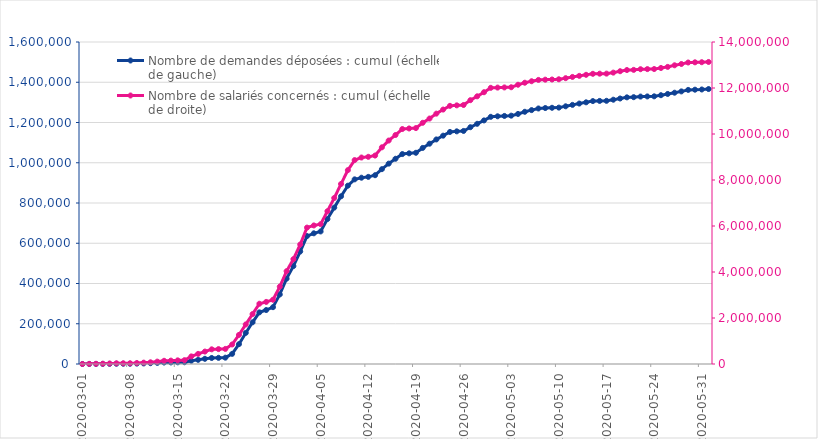
| Category | Nombre de demandes déposées : cumul (échelle de gauche) |
|---|---|
| 2020-03-01 | 1 |
| 2020-03-02 | 126 |
| 2020-03-03 | 291 |
| 2020-03-04 | 493 |
| 2020-03-05 | 799 |
| 2020-03-06 | 1277 |
| 2020-03-07 | 1302 |
| 2020-03-08 | 1319 |
| 2020-03-09 | 1952 |
| 2020-03-10 | 2803 |
| 2020-03-11 | 3916 |
| 2020-03-12 | 5468 |
| 2020-03-13 | 7249 |
| 2020-03-14 | 7716 |
| 2020-03-15 | 8366 |
| 2020-03-16 | 8691 |
| 2020-03-17 | 16174 |
| 2020-03-18 | 20724 |
| 2020-03-19 | 25761 |
| 2020-03-20 | 30001 |
| 2020-03-21 | 30650 |
| 2020-03-22 | 31464 |
| 2020-03-23 | 50451 |
| 2020-03-24 | 98610 |
| 2020-03-25 | 154441 |
| 2020-03-26 | 207199 |
| 2020-03-27 | 256567 |
| 2020-03-28 | 268181 |
| 2020-03-29 | 282345 |
| 2020-03-30 | 345522 |
| 2020-03-31 | 424077 |
| 2020-04-01 | 486489 |
| 2020-04-02 | 558931 |
| 2020-04-03 | 635746 |
| 2020-04-04 | 649426 |
| 2020-04-05 | 658619 |
| 2020-04-06 | 720233 |
| 2020-04-07 | 777060 |
| 2020-04-08 | 833313 |
| 2020-04-09 | 886014 |
| 2020-04-10 | 917469 |
| 2020-04-11 | 925667 |
| 2020-04-12 | 929850 |
| 2020-04-13 | 938056 |
| 2020-04-14 | 968133 |
| 2020-04-15 | 995592 |
| 2020-04-16 | 1019842 |
| 2020-04-17 | 1043154 |
| 2020-04-18 | 1046810 |
| 2020-04-19 | 1049537 |
| 2020-04-20 | 1073713 |
| 2020-04-21 | 1094748 |
| 2020-04-22 | 1115829 |
| 2020-04-23 | 1134569 |
| 2020-04-24 | 1153040 |
| 2020-04-25 | 1156019 |
| 2020-04-26 | 1158008 |
| 2020-04-27 | 1176607 |
| 2020-04-28 | 1193548 |
| 2020-04-29 | 1210335 |
| 2020-04-30 | 1228238 |
| 2020-05-01 | 1230851 |
| 2020-05-02 | 1232604 |
| 2020-05-03 | 1234010 |
| 2020-05-04 | 1242497 |
| 2020-05-05 | 1253205 |
| 2020-05-06 | 1261642 |
| 2020-05-07 | 1269642 |
| 2020-05-08 | 1271844 |
| 2020-05-09 | 1273149 |
| 2020-05-10 | 1274017 |
| 2020-05-11 | 1280465 |
| 2020-05-12 | 1287513 |
| 2020-05-13 | 1294171 |
| 2020-05-14 | 1300274 |
| 2020-05-15 | 1306412 |
| 2020-05-16 | 1307216 |
| 2020-05-17 | 1307794 |
| 2020-05-18 | 1313274 |
| 2020-05-19 | 1319220 |
| 2020-05-20 | 1324960 |
| 2020-05-21 | 1325846 |
| 2020-05-22 | 1328811 |
| 2020-05-23 | 1329505 |
| 2020-05-24 | 1330031 |
| 2020-05-25 | 1335607 |
| 2020-05-26 | 1341905 |
| 2020-05-27 | 1348015 |
| 2020-05-28 | 1354511 |
| 2020-05-29 | 1361928 |
| 2020-05-30 | 1363058 |
| 2020-05-31 | 1364072 |
| 2020-06-01 | 1366332 |